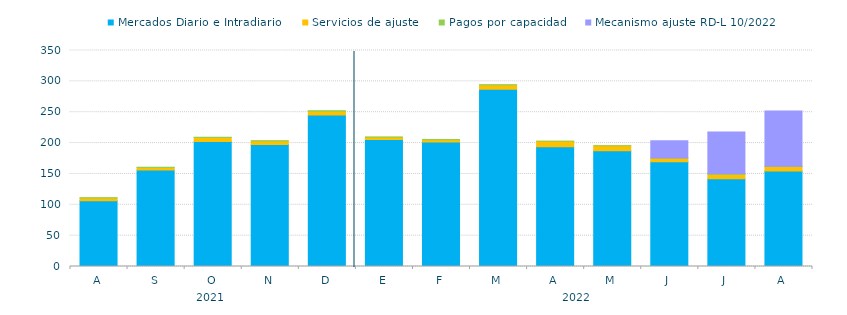
| Category | Mercados Diario e Intradiario  | Servicios de ajuste | Pagos por capacidad | Mecanismo ajuste RD-L 10/2022 |
|---|---|---|---|---|
| A | 106.41 | 4.62 | 0.31 | 0 |
| S | 156.53 | 3.87 | 0.31 | 0 |
| O | 202.39 | 6.69 | 0.26 | 0 |
| N | 197.49 | 5.94 | 0.38 | 0 |
| D | 245.66 | 5.99 | 0.55 | 0 |
| E | 205.75 | 3.78 | 0.43 | 0 |
| F | 201.85 | 3.39 | 0.46 | 0 |
| M | 287.06 | 6.92 | 0.33 | 0 |
| A | 194.16 | 8.63 | 0.24 | 0 |
| M | 187.74 | 7.84 | 0.23 | 0 |
| J | 169.75 | 6 | 0.25 | 27.64 |
| J | 142.38 | 7.284 | 0.43 | 67.984 |
| A | 154.58 | 7.58 | 0.25 | 89.53 |